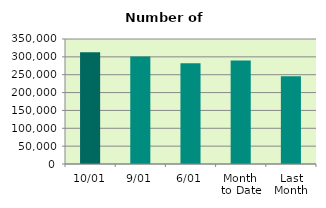
| Category | Series 0 |
|---|---|
| 10/01 | 313102 |
| 9/01 | 301226 |
| 6/01 | 281852 |
| Month 
to Date | 289702.571 |
| Last
Month | 245553.619 |